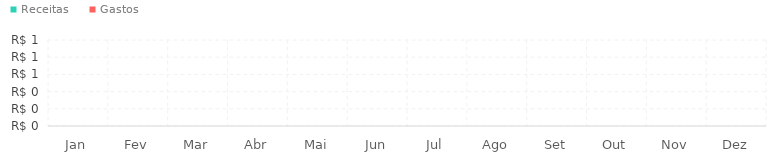
| Category | Receitas | Gastos |
|---|---|---|
| Jan | 0 | 0 |
| Fev | 0 | 0 |
| Mar | 0 | 0 |
| Abr | 0 | 0 |
| Mai | 0 | 0 |
| Jun | 0 | 0 |
| Jul | 0 | 0 |
| Ago | 0 | 0 |
| Set | 0 | 0 |
| Out | 0 | 0 |
| Nov | 0 | 0 |
| Dez | 0 | 0 |